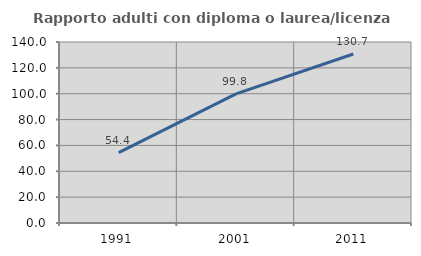
| Category | Rapporto adulti con diploma o laurea/licenza media  |
|---|---|
| 1991.0 | 54.408 |
| 2001.0 | 99.843 |
| 2011.0 | 130.727 |